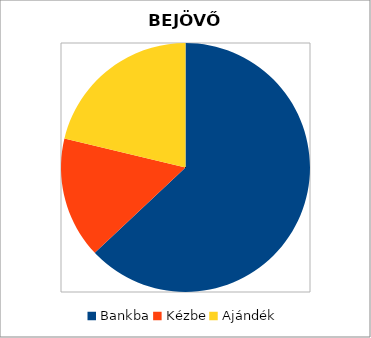
| Category | BE |
|---|---|
| Bankba | 800 |
| Kézbe | 200 |
| Ajándék | 270 |